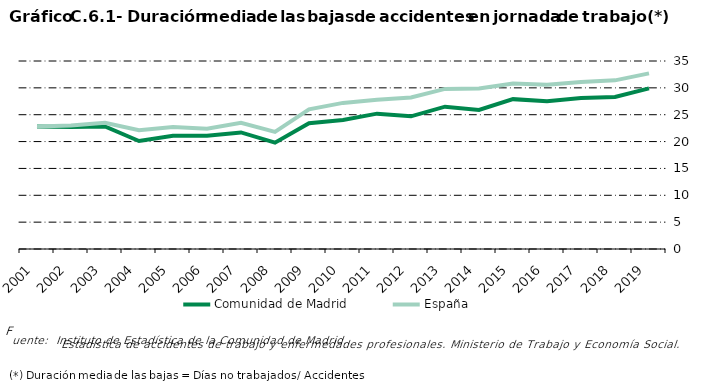
| Category | Comunidad de Madrid | España |
|---|---|---|
| 2001.0 | 22.8 | 22.8 |
| 2002.0 | 22.7 | 23 |
| 2003.0 | 22.8 | 23.5 |
| 2004.0 | 20.1 | 22.1 |
| 2005.0 | 21.1 | 22.7 |
| 2006.0 | 21.1 | 22.4 |
| 2007.0 | 21.7 | 23.5 |
| 2008.0 | 19.8 | 21.8 |
| 2009.0 | 23.4 | 26 |
| 2010.0 | 24 | 27.2 |
| 2011.0 | 25.2 | 27.8 |
| 2012.0 | 24.7 | 28.2 |
| 2013.0 | 26.5 | 29.8 |
| 2014.0 | 25.9 | 29.9 |
| 2015.0 | 27.9 | 30.8 |
| 2016.0 | 27.5 | 30.6 |
| 2017.0 | 28.1 | 31.1 |
| 2018.0 | 28.3 | 31.4 |
| 2019.0 | 29.9 | 32.7 |